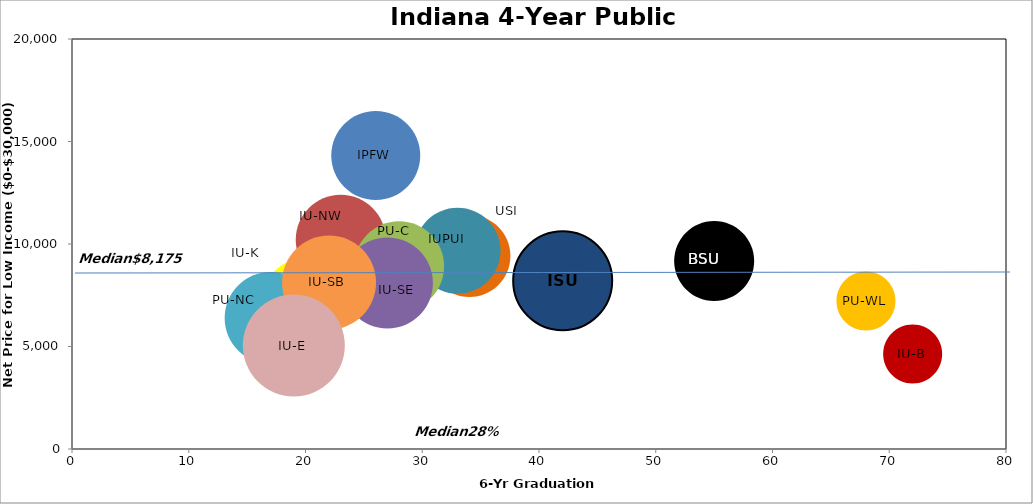
| Category | Series 0 |
|---|---|
| 72.0 | 4632 |
| 68.0 | 7228 |
| 55.0 | 9178 |
| 34.0 | 9434 |
| 33.0 | 9684 |
| 20.0 | 7144 |
| 26.0 | 14323 |
| 23.0 | 10220 |
| 28.0 | 8924 |
| 27.0 | 8102 |
| 17.0 | 6396 |
| 22.0 | 8129 |
| 42.0 | 8220 |
| 19.0 | 5045 |